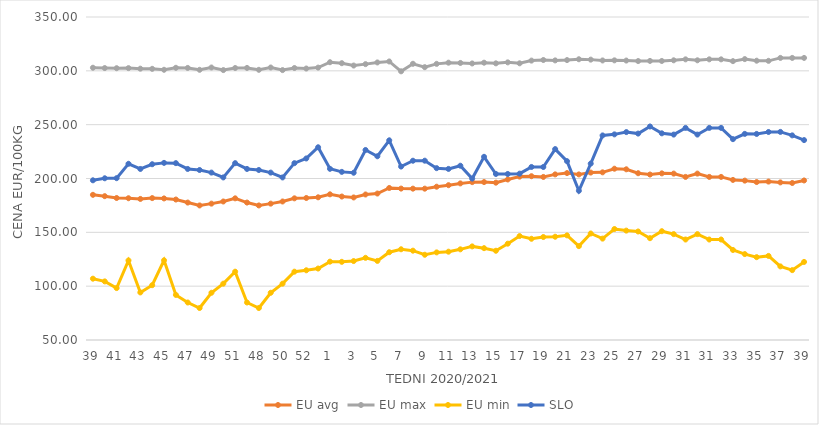
| Category | EU avg | EU max | EU min | SLO |
|---|---|---|---|---|
| 39.0 | 184.836 | 302.88 | 106.953 | 198.33 |
| 40.0 | 183.595 | 302.56 | 104.426 | 200.21 |
| 41.0 | 181.893 | 302.44 | 98.23 | 200.3 |
| 42.0 | 181.671 | 302.52 | 123.908 | 213.66 |
| 43.0 | 181.023 | 302.01 | 94.177 | 208.86 |
| 44.0 | 181.795 | 301.86 | 100.908 | 213.25 |
| 45.0 | 181.489 | 300.98 | 124 | 214.51 |
| 46.0 | 180.473 | 302.82 | 91.889 | 214.27 |
| 47.0 | 177.656 | 302.7 | 84.832 | 208.87 |
| 48.0 | 174.977 | 300.94 | 79.697 | 207.9 |
| 49.0 | 176.65 | 303.09 | 93.873 | 205.48 |
| 50.0 | 178.648 | 300.7 | 102.316 | 200.99 |
| 51.0 | 181.58 | 302.62 | 113.46 | 214.25 |
| 47.0 | 177.656 | 302.7 | 84.832 | 208.87 |
| 48.0 | 174.977 | 300.94 | 79.697 | 207.9 |
| 49.0 | 176.65 | 303.09 | 93.873 | 205.48 |
| 50.0 | 178.648 | 300.7 | 102.316 | 200.99 |
| 51.0 | 181.58 | 302.62 | 113.46 | 214.25 |
| 52.0 | 181.9 | 302.14 | 114.76 | 218.61 |
| 53.0 | 182.536 | 303 | 116.375 | 229 |
| 1.0 | 185.3 | 308 | 122.769 | 209 |
| 2.0 | 183.25 | 307.1 | 122.609 | 206.15 |
| 3.0 | 182.393 | 304.91 | 123.32 | 205.35 |
| 4.0 | 185.158 | 306.22 | 126.329 | 226.48 |
| 5.0 | 186.04 | 307.79 | 123.461 | 220.65 |
| 6.0 | 191.206 | 308.7 | 131.528 | 235.46 |
| 7.0 | 190.629 | 299.55 | 134.262 | 211.1 |
| 8.0 | 190.57 | 306.55 | 132.97 | 216.51 |
| 9.0 | 190.562 | 303.4 | 129.173 | 216.54 |
| 10.0 | 192.373 | 306.48 | 131.374 | 209.61 |
| 11.0 | 193.79 | 307.58 | 132.024 | 208.91 |
| 12.0 | 195.449 | 307.33 | 134.212 | 211.87 |
| 13.0 | 196.631 | 306.85 | 136.936 | 199.93 |
| 14.0 | 196.702 | 307.56 | 135.297 | 220.15 |
| 15.0 | 196.13 | 306.96 | 132.893 | 204.2 |
| 16.0 | 199.1 | 307.87 | 139.462 | 204.2 |
| 17.0 | 201.754 | 306.98 | 146.538 | 204.51 |
| 18.0 | 202.13 | 309.49 | 144.017 | 210.72 |
| 19.0 | 201.439 | 310.06 | 145.644 | 210.68 |
| 20.0 | 203.834 | 309.69 | 145.911 | 227.32 |
| 21.0 | 205.04 | 309.99 | 147.188 | 216.08 |
| 22.0 | 203.79 | 310.76 | 137.177 | 188.6 |
| 23.0 | 205.51 | 310.41 | 148.928 | 213.84 |
| 24.0 | 205.73 | 309.64 | 144.161 | 239.99 |
| 25.0 | 209.095 | 309.74 | 153.081 | 240.99 |
| 26.0 | 208.551 | 309.55 | 151.599 | 243.11 |
| 27.0 | 204.914 | 309.08 | 150.789 | 241.72 |
| 28.0 | 203.681 | 309.21 | 144.56 | 248.33 |
| 29.0 | 204.773 | 309.15 | 151.052 | 241.96 |
| 30.0 | 204.558 | 309.78 | 148.33 | 240.79 |
| 31.0 | 201.483 | 310.67 | 143.33 | 247 |
| 30.0 | 204.558 | 309.78 | 148.33 | 240.79 |
| 31.0 | 201.483 | 310.67 | 143.33 | 247 |
| 32.0 | 201.483 | 310.67 | 143.33 | 247 |
| 33.0 | 198.691 | 309 | 133.607 | 236.54 |
| 34.0 | 198.027 | 310.9 | 129.797 | 241.45 |
| 35.0 | 196.72 | 309.41 | 126.926 | 241.39 |
| 36.0 | 197.157 | 309.28 | 128.099 | 243.19 |
| 37.0 | 196.375 | 312 | 118.364 | 243.28 |
| 38.0 | 195.821 | 312 | 114.892 | 240.06 |
| 39.0 | 198.179 | 312 | 122.517 | 235.66 |